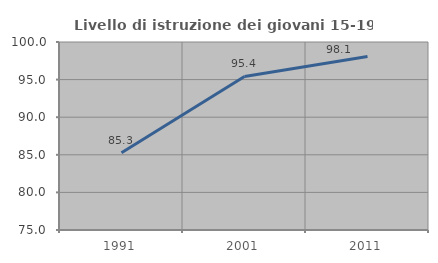
| Category | Livello di istruzione dei giovani 15-19 anni |
|---|---|
| 1991.0 | 85.268 |
| 2001.0 | 95.425 |
| 2011.0 | 98.058 |